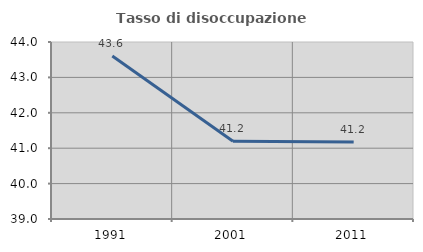
| Category | Tasso di disoccupazione giovanile  |
|---|---|
| 1991.0 | 43.604 |
| 2001.0 | 41.197 |
| 2011.0 | 41.176 |